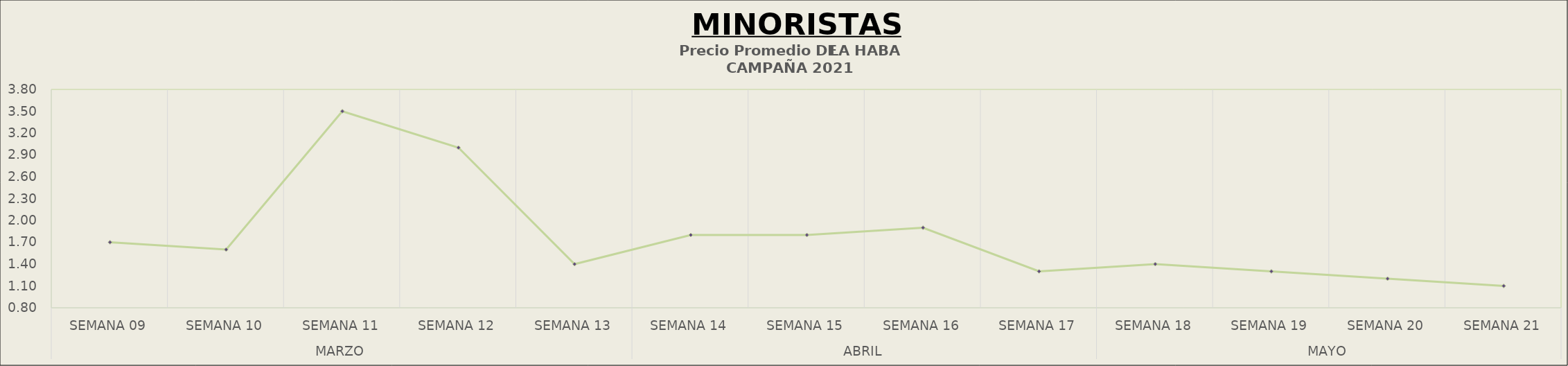
| Category | Precio Promedio ( S/.x Kg.) |
|---|---|
| 0 | 1.7 |
| 1 | 1.6 |
| 2 | 3.5 |
| 3 | 3 |
| 4 | 1.4 |
| 5 | 1.8 |
| 6 | 1.8 |
| 7 | 1.9 |
| 8 | 1.3 |
| 9 | 1.4 |
| 10 | 1.3 |
| 11 | 1.2 |
| 12 | 1.1 |